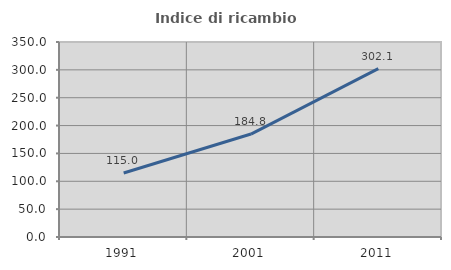
| Category | Indice di ricambio occupazionale  |
|---|---|
| 1991.0 | 114.961 |
| 2001.0 | 184.768 |
| 2011.0 | 302.098 |